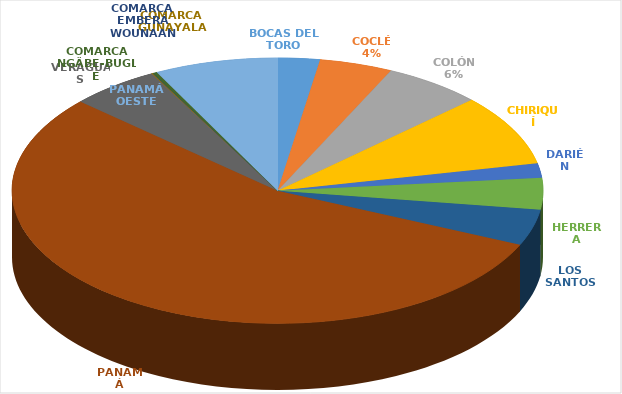
| Category | Cantidad  |
|---|---|
| BOCAS DEL TORO | 152 |
| COCLÉ | 264 |
| COLÓN | 356 |
| CHIRIQUÍ | 515 |
| DARIÉN | 105 |
| HERRERA | 227 |
| LOS SANTOS | 261 |
| PANAMÁ | 3264 |
| VERAGUAS | 323 |
| COMARCA GUNAYALA | 5 |
| COMARCA EMBERÁ WOUNAAN | 1 |
| COMARCA NGÄBE-BUGLÉ | 15 |
| PANAMÁ OESTE | 445 |